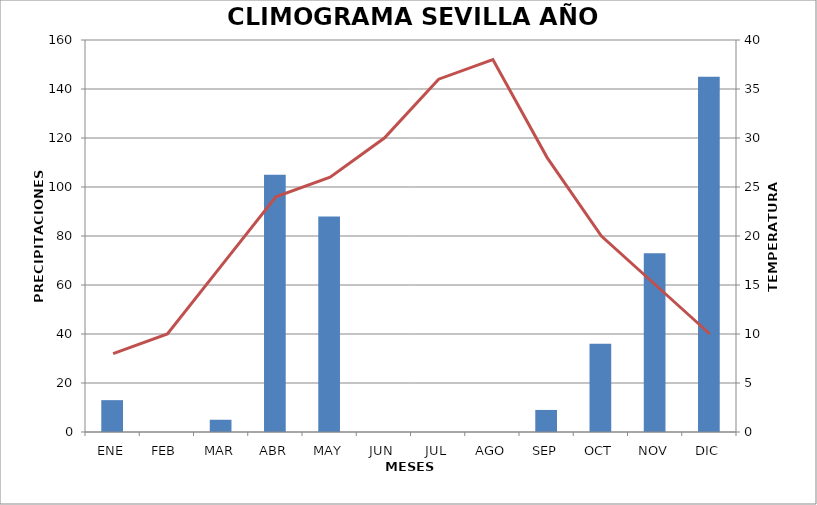
| Category | PRECIPITACIONES |
|---|---|
| ENE | 13 |
| FEB | 0 |
| MAR | 5 |
| ABR | 105 |
| MAY | 88 |
| JUN | 0 |
| JUL | 0 |
| AGO | 0 |
| SEP | 9 |
| OCT | 36 |
| NOV | 73 |
| DIC | 145 |